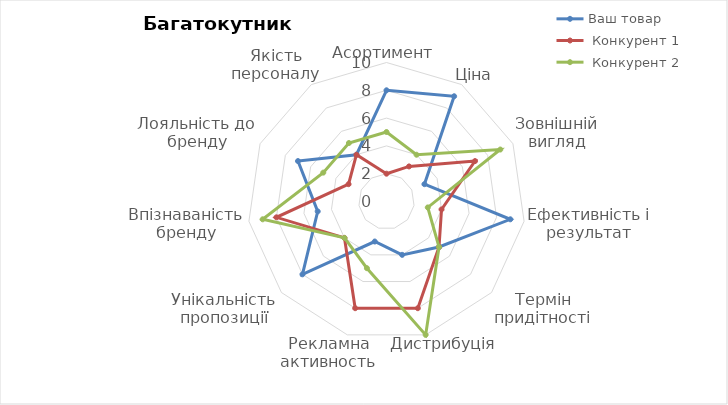
| Category | Ваш товар |  Конкурент 1 |  Конкурент 2 |
|---|---|---|---|
| Асортимент | 8 | 2 | 5 |
| Ціна | 9 | 3 | 4 |
| Зовнішній вигляд | 3 | 7 | 9 |
| Ефективність і результат | 9 | 4 | 3 |
| Термін придітності | 5 | 5 | 5 |
| Дистрибуція | 4 | 8 | 10 |
| Рекламна активность | 3 | 8 | 5 |
| Унікальність пропозиції | 8 | 4 | 4 |
| Впізнаваність бренду | 5 | 8 | 9 |
| Лояльність до бренду | 7 | 3 | 5 |
| Якість персоналу | 4 | 4 | 5 |